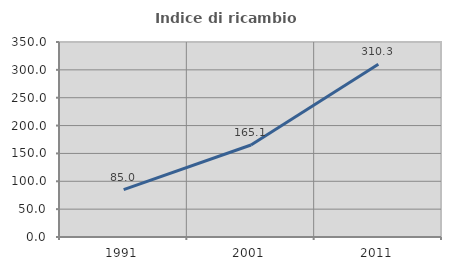
| Category | Indice di ricambio occupazionale  |
|---|---|
| 1991.0 | 85 |
| 2001.0 | 165.116 |
| 2011.0 | 310.256 |